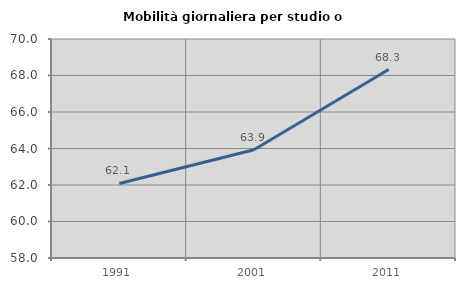
| Category | Mobilità giornaliera per studio o lavoro |
|---|---|
| 1991.0 | 62.084 |
| 2001.0 | 63.931 |
| 2011.0 | 68.328 |